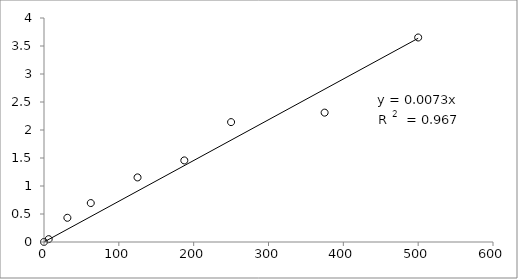
| Category | Series 0 |
|---|---|
| 500.0 | 3.652 |
| 375.0 | 2.31 |
| 250.0 | 2.141 |
| 187.5 | 1.457 |
| 125.0 | 1.153 |
| 62.5 | 0.695 |
| 31.25 | 0.432 |
| 6.25 | 0.051 |
| 0.0 | 0.001 |